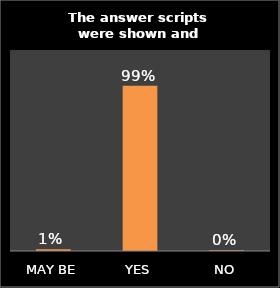
| Category | Series 0 |
|---|---|
| MAY BE | 0.01 |
| YES | 0.987 |
| NO | 0.004 |